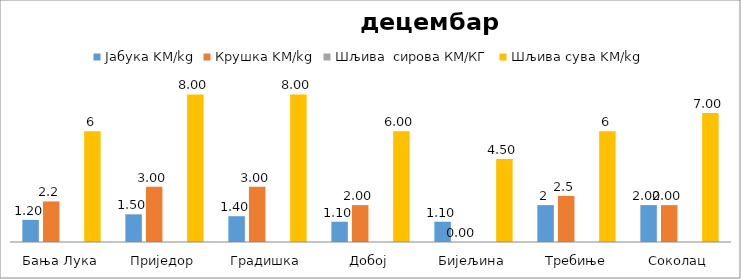
| Category | Јабука KM/kg | Крушка KM/kg | Шљива  сирова КМ/КГ | Шљива сува KM/kg |
|---|---|---|---|---|
| Бања Лука | 1.2 | 2.2 |  | 6 |
| Приједор | 1.5 | 3 |  | 8 |
| Градишка | 1.4 | 3 |  | 8 |
| Добој | 1.1 | 2 |  | 6 |
| Бијељина | 1.1 | 0 |  | 4.5 |
|  Требиње | 2 | 2.5 |  | 6 |
| Соколац | 2 | 2 |  | 7 |